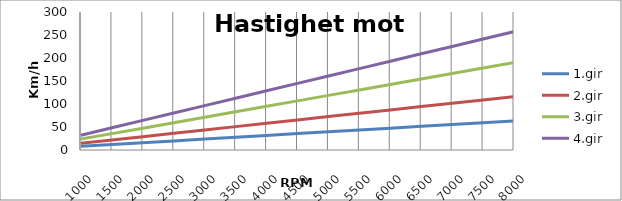
| Category | 1.gir | 2.gir | 3.gir | 4.gir |
|---|---|---|---|---|
| 1000.0 | 7.914 | 14.522 | 23.743 | 32.168 |
| 1500.0 | 11.871 | 21.784 | 35.614 | 48.252 |
| 2000.0 | 15.829 | 29.045 | 47.486 | 64.336 |
| 2500.0 | 19.786 | 36.306 | 59.357 | 80.42 |
| 3000.0 | 23.743 | 43.567 | 71.229 | 96.503 |
| 3500.0 | 27.7 | 50.828 | 83.1 | 112.587 |
| 4000.0 | 31.657 | 58.089 | 94.972 | 128.671 |
| 4500.0 | 35.614 | 65.351 | 106.843 | 144.755 |
| 5000.0 | 39.572 | 72.612 | 118.715 | 160.839 |
| 5500.0 | 43.529 | 79.873 | 130.586 | 176.923 |
| 6000.0 | 47.486 | 87.134 | 142.457 | 193.007 |
| 6500.0 | 51.443 | 94.395 | 154.329 | 209.091 |
| 7000.0 | 55.4 | 101.657 | 166.2 | 225.175 |
| 7500.0 | 59.357 | 108.918 | 178.072 | 241.259 |
| 8000.0 | 63.314 | 116.179 | 189.943 | 257.343 |